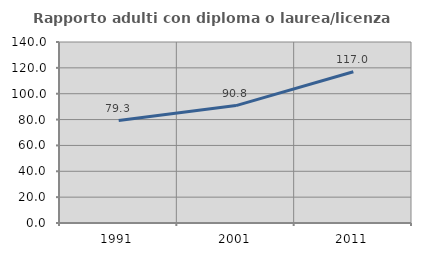
| Category | Rapporto adulti con diploma o laurea/licenza media  |
|---|---|
| 1991.0 | 79.272 |
| 2001.0 | 90.82 |
| 2011.0 | 117.014 |